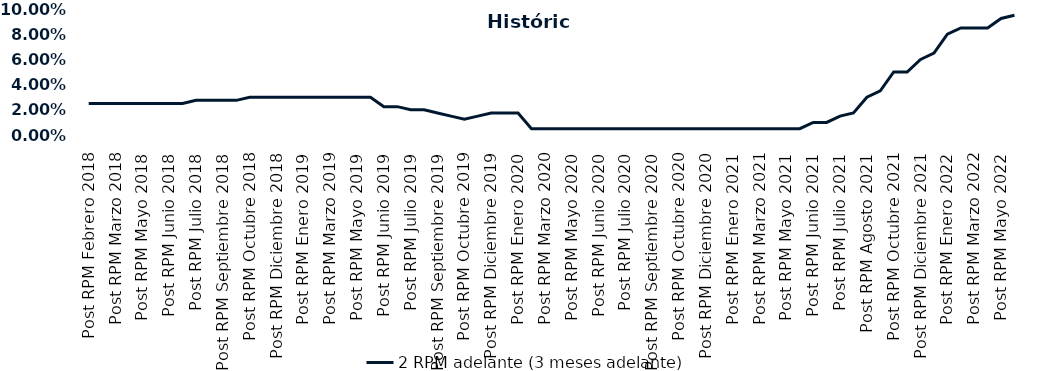
| Category | 2 RPM adelante (3 meses adelante) |
|---|---|
| Post RPM Febrero 2018 | 0.025 |
| Pre RPM Marzo 2018 | 0.025 |
| Post RPM Marzo 2018 | 0.025 |
| Pre RPM Mayo 2018 | 0.025 |
| Post RPM Mayo 2018 | 0.025 |
| Pre RPM Junio 2018 | 0.025 |
| Post RPM Junio 2018 | 0.025 |
| Pre RPM Julio 2018 | 0.025 |
| Post RPM Julio 2018 | 0.028 |
| Pre RPM Septiembre 2018 | 0.028 |
| Post RPM Septiembre 2018 | 0.028 |
| Pre RPM Octubre 2018 | 0.028 |
| Post RPM Octubre 2018 | 0.03 |
| Pre RPM Diciembre 2018 | 0.03 |
| Post RPM Diciembre 2018 | 0.03 |
| Pre RPM Enero 2019 | 0.03 |
| Post RPM Enero 2019 | 0.03 |
| Pre RPM Marzo 2019 | 0.03 |
| Post RPM Marzo 2019 | 0.03 |
| Pre RPM Mayo 2019 | 0.03 |
| Post RPM Mayo 2019 | 0.03 |
| Pre RPM Junio 2019 | 0.03 |
| Post RPM Junio 2019 | 0.022 |
| Pre RPM Julio 2019 | 0.022 |
| Post RPM Julio 2019 | 0.02 |
| Pre RPM Septiembre 2019 | 0.02 |
| Post RPM Septiembre 2019 | 0.018 |
| Pre RPM Octubre 2019 | 0.015 |
| Post RPM Octubre 2019 | 0.012 |
| Pre RPM Diciembre 2019 | 0.015 |
| Post RPM Diciembre 2019 | 0.018 |
| Pre RPM Enero 2020 | 0.018 |
| Post RPM Enero 2020 | 0.018 |
| Pre RPM Marzo 2020 | 0.005 |
| Post RPM Marzo 2020 | 0.005 |
| Pre RPM Mayo 2020 | 0.005 |
| Post RPM Mayo 2020 | 0.005 |
| Pre RPM Junio 2020 | 0.005 |
| Post RPM Junio 2020 | 0.005 |
| Pre RPM Julio 2020 | 0.005 |
| Post RPM Julio 2020 | 0.005 |
| Pre RPM Septiembre 2020 | 0.005 |
| Post RPM Septiembre 2020 | 0.005 |
| Pre RPM Octubre 2020 | 0.005 |
| Post RPM Octubre 2020 | 0.005 |
| Pre RPM Diciembre 2020 | 0.005 |
| Post RPM Diciembre 2020 | 0.005 |
| Pre RPM Enero 2021 | 0.005 |
| Post RPM Enero 2021 | 0.005 |
| Pre RPM Marzo 2021 | 0.005 |
| Post RPM Marzo 2021 | 0.005 |
| Pre RPM Mayo 2021 | 0.005 |
| Post RPM Mayo 2021 | 0.005 |
| Pre RPM Junio 2021 | 0.005 |
| Post RPM Junio 2021 | 0.01 |
| Pre RPM Julio 2021 | 0.01 |
| Post RPM Julio 2021 | 0.015 |
| Pre RPM Agosto 2021 | 0.018 |
| Post RPM Agosto 2021 | 0.03 |
| Pre RPM Octubre 2021 | 0.035 |
| Post RPM Octubre 2021 | 0.05 |
| Pre RPM Diciembre 2021 | 0.05 |
| Post RPM Diciembre 2021 | 0.06 |
| Pre RPM Enero 2022 | 0.065 |
| Post RPM Enero 2022 | 0.08 |
| Pre RPM Marzo 2022 | 0.085 |
| Post RPM Marzo 2022 | 0.085 |
| Pre RPM Mayo 2022 | 0.085 |
| Post RPM Mayo 2022 | 0.092 |
| Pre RPM Junio 2022 | 0.095 |